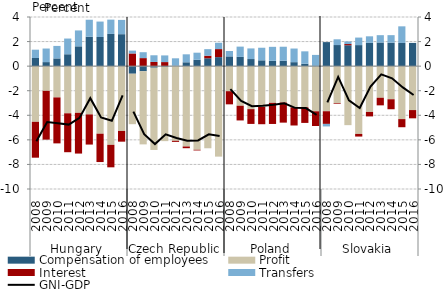
| Category | Compensation of employees | Profit | Interest  | Transfers |
|---|---|---|---|---|
| 0 | 0.664 | -4.532 | -2.919 | 0.675 |
| 1 | 0.329 | -2.01 | -3.971 | 1.105 |
| 2 | 0.629 | -2.546 | -3.74 | 1.018 |
| 3 | 0.968 | -3.839 | -3.167 | 1.279 |
| 4 | 1.614 | -3.8 | -3.316 | 1.293 |
| 5 | 2.392 | -3.93 | -2.454 | 1.385 |
| 6 | 2.373 | -5.499 | -2.307 | 1.255 |
| 7 | 2.623 | -6.405 | -1.831 | 1.164 |
| 8 | 2.601 | -5.275 | -0.872 | 1.162 |
| 9 | -0.617 | -4.107 | 1.033 | 0.232 |
| 10 | -0.414 | -5.955 | 0.655 | 0.48 |
| 11 | -0.129 | -6.692 | 0.341 | 0.544 |
| 12 | -0.056 | -6.047 | 0.331 | 0.543 |
| 13 | 0.037 | -6.077 | -0.087 | 0.602 |
| 14 | 0.314 | -6.54 | -0.139 | 0.649 |
| 15 | 0.516 | -6.808 | -0.055 | 0.579 |
| 16 | 0.64 | -6.685 | 0.209 | 0.534 |
| 17 | 0.734 | -7.365 | 0.654 | 0.516 |
| 18 | 0.796 | -2.039 | -1.07 | 0.437 |
| 19 | 0.752 | -3.224 | -1.196 | 0.838 |
| 20 | 0.578 | -3.5 | -1.203 | 0.865 |
| 21 | 0.474 | -3.318 | -1.409 | 1.024 |
| 22 | 0.432 | -2.988 | -1.718 | 1.14 |
| 23 | 0.442 | -2.96 | -1.638 | 1.138 |
| 24 | 0.324 | -3.35 | -1.481 | 1.11 |
| 25 | 0.195 | -3.346 | -1.275 | 1.01 |
| 26 | -0.028 | -3.647 | -1.198 | 0.915 |
| 27 | 1.956 | -3.67 | -1.031 | -0.207 |
| 28 | 1.718 | -3.008 | -0.053 | 0.467 |
| 29 | 1.698 | -4.803 | 0.101 | 0.213 |
| 30 | 1.713 | -5.517 | -0.215 | 0.613 |
| 31 | 1.898 | -3.727 | -0.364 | 0.53 |
| 32 | 1.925 | -2.573 | -0.619 | 0.596 |
| 33 | 1.908 | -2.696 | -0.813 | 0.614 |
| 34 | 1.886 | -4.311 | -0.661 | 1.354 |
| 35 | 1.885 | -3.576 | -0.672 | 0.013 |